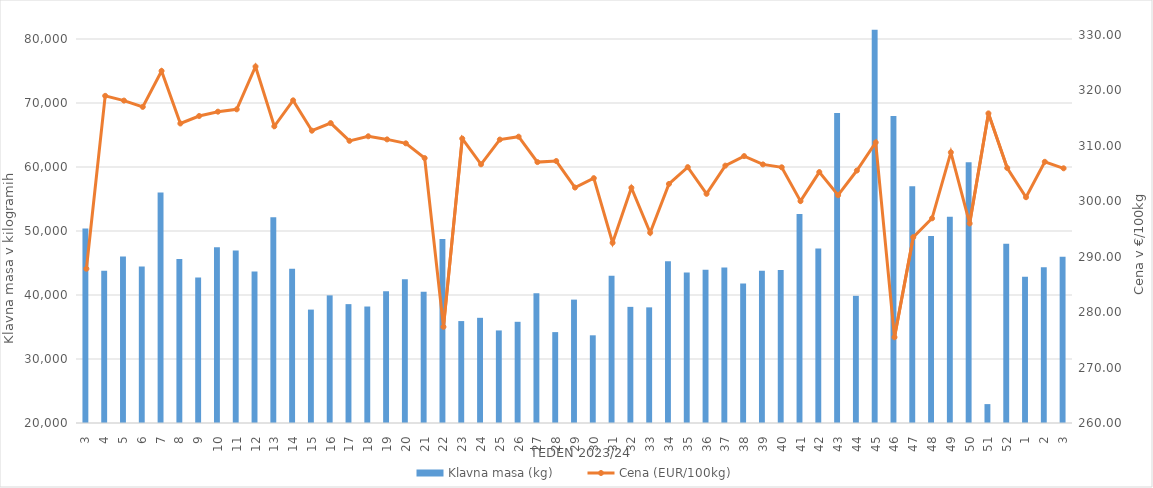
| Category | Klavna masa (kg) |
|---|---|
| 3.0 | 50386 |
| 4.0 | 43773 |
| 5.0 | 46011 |
| 6.0 | 44439 |
| 7.0 | 56001 |
| 8.0 | 45613 |
| 9.0 | 42730 |
| 10.0 | 47471 |
| 11.0 | 46952 |
| 12.0 | 43683 |
| 13.0 | 52135 |
| 14.0 | 44103 |
| 15.0 | 37719 |
| 16.0 | 39943 |
| 17.0 | 38574 |
| 18.0 | 38200 |
| 19.0 | 40581 |
| 20.0 | 42443 |
| 21.0 | 40517 |
| 22.0 | 48742 |
| 23.0 | 35927 |
| 24.0 | 36436 |
| 25.0 | 34463 |
| 26.0 | 35812 |
| 27.0 | 40280 |
| 28.0 | 34201 |
| 29.0 | 39279 |
| 30.0 | 33702 |
| 31.0 | 43020 |
| 32.0 | 38146 |
| 33.0 | 38070 |
| 34.0 | 45290 |
| 35.0 | 43513 |
| 36.0 | 43945 |
| 37.0 | 44302 |
| 38.0 | 41798 |
| 39.0 | 43790 |
| 40.0 | 43913 |
| 41.0 | 52663 |
| 42.0 | 47275 |
| 43.0 | 68419 |
| 44.0 | 39872 |
| 45.0 | 81439 |
| 46.0 | 67983 |
| 47.0 | 57006 |
| 48.0 | 49204 |
| 49.0 | 52219 |
| 50.0 | 60759 |
| 51.0 | 22954 |
| 52.0 | 48002 |
| 1.0 | 42866 |
| 2.0 | 44318 |
| 3.0 | 45969 |